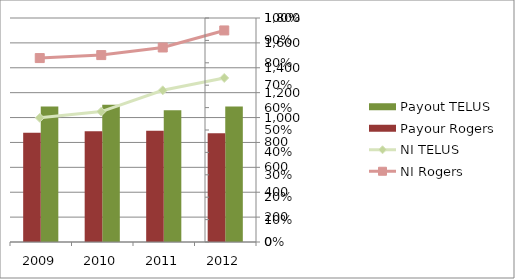
| Category | Payout TELUS | Payour Rogers |
|---|---|---|
| 0 | 0.605 | 0.485 |
| 1 | 0.588 | 0.497 |
| 2 | 0.613 | 0.494 |
| 3 | 0.605 | 0.487 |